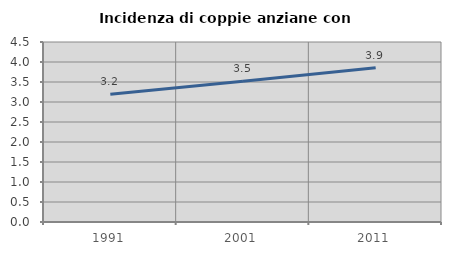
| Category | Incidenza di coppie anziane con figli |
|---|---|
| 1991.0 | 3.191 |
| 2001.0 | 3.52 |
| 2011.0 | 3.856 |